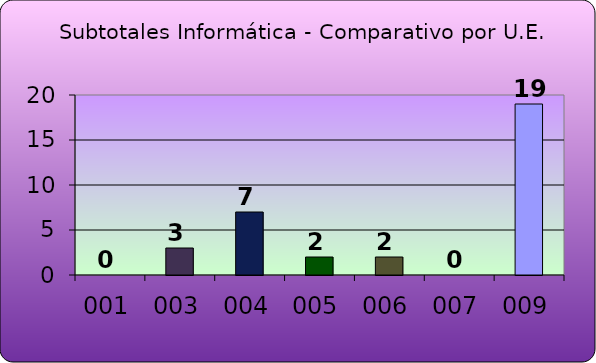
| Category | SIC INF. MTOP |
|---|---|
| 001 | 0 |
| 003 | 3 |
| 004 | 7 |
| 005 | 2 |
| 006 | 2 |
| 007 | 0 |
| 009 | 19 |